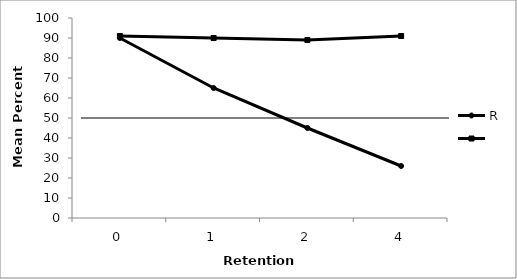
| Category | R | Series 1 |
|---|---|---|
| 0.0 | 90 | 91 |
| 1.0 | 65 | 90 |
| 2.0 | 45 | 89 |
| 4.0 | 26 | 91 |